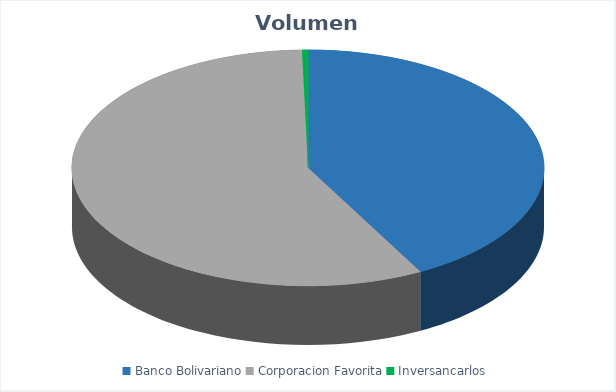
| Category | VOLUMEN ($USD) |
|---|---|
| Banco Bolivariano | 45000 |
| Corporacion Favorita | 61431 |
| Inversancarlos | 431.2 |